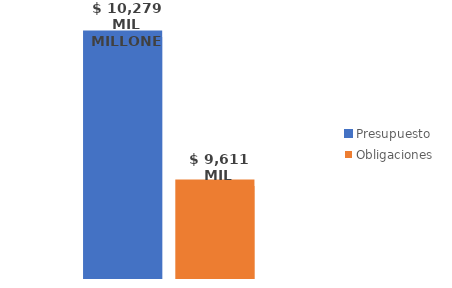
| Category | Presupuesto | Obligaciones |
|---|---|---|
| Total | 10278755448205.232 | 9611477189285.848 |